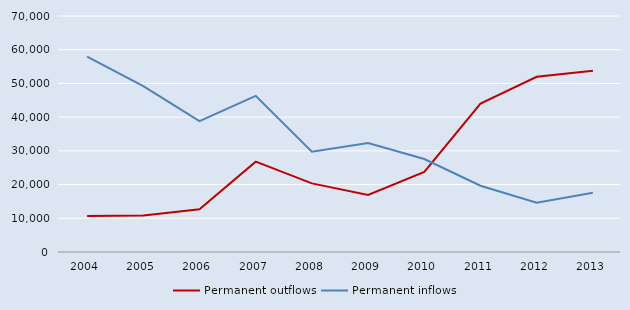
| Category | Permanent outflows | Permanent inflows |
|---|---|---|
| 2004.0 | 10680 | 57920 |
| 2005.0 | 10800 | 49200 |
| 2006.0 | 12700 | 38800 |
| 2007.0 | 26800 | 46300 |
| 2008.0 | 20357 | 29718 |
| 2009.0 | 16899 | 32307 |
| 2010.0 | 23760 | 27575 |
| 2011.0 | 43998 | 19667 |
| 2012.0 | 51958 | 14606 |
| 2013.0 | 53786 | 17554 |